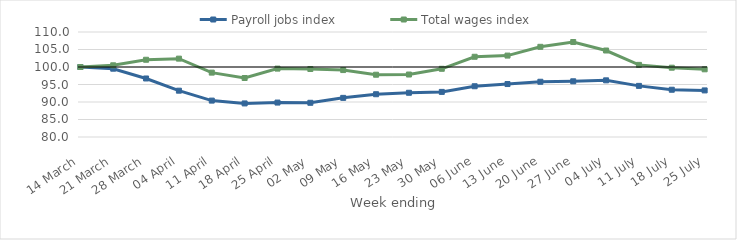
| Category | Payroll jobs index | Total wages index |
|---|---|---|
| 2020-03-14 | 100 | 100 |
| 2020-03-21 | 99.514 | 100.486 |
| 2020-03-28 | 96.722 | 102.069 |
| 2020-04-04 | 93.235 | 102.389 |
| 2020-04-11 | 90.401 | 98.394 |
| 2020-04-18 | 89.591 | 96.857 |
| 2020-04-25 | 89.839 | 99.54 |
| 2020-05-02 | 89.775 | 99.426 |
| 2020-05-09 | 91.183 | 99.123 |
| 2020-05-16 | 92.222 | 97.794 |
| 2020-05-23 | 92.636 | 97.849 |
| 2020-05-30 | 92.887 | 99.489 |
| 2020-06-06 | 94.503 | 102.923 |
| 2020-06-13 | 95.13 | 103.262 |
| 2020-06-20 | 95.783 | 105.765 |
| 2020-06-27 | 95.917 | 107.137 |
| 2020-07-04 | 96.188 | 104.714 |
| 2020-07-11 | 94.607 | 100.608 |
| 2020-07-18 | 93.503 | 99.802 |
| 2020-07-25 | 93.311 | 99.342 |